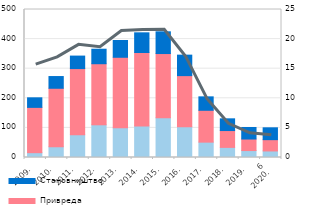
| Category | Остали сектори | Привреда | Становништво |
|---|---|---|---|
| 2009. | 16.3 | 153.043 | 32.3 |
| 2010. | 36.3 | 197.6 | 39.6 |
| 2011. | 77.1 | 223.3 | 42.2 |
| 2012. | 110.5 | 206.3 | 49 |
| 2013. | 100.2 | 238.4 | 56.7 |
| 2014. | 106.4 | 248.4 | 66.4 |
| 2015. | 134.4 | 216.8 | 73.4 |
| 2016. | 103.8 | 172.8 | 69.2 |
| 2017. | 51.9 | 107.6 | 45.4 |
| 2018. | 34.192 | 56.849 | 39.608 |
| 2019. | 23.45 | 38.949 | 39.017 |
| 6
2020. | 22.095 | 38.183 | 40.051 |